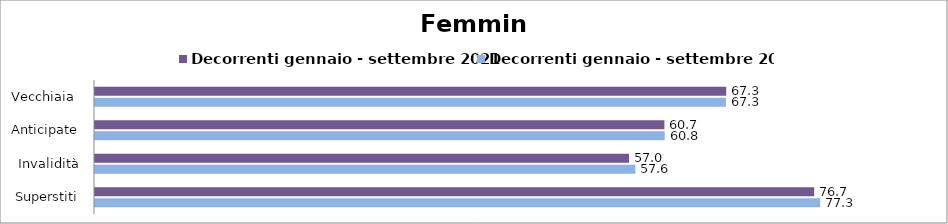
| Category | Decorrenti gennaio - settembre 2021 | Decorrenti gennaio - settembre 2022 |
|---|---|---|
| Vecchiaia  | 67.31 | 67.28 |
| Anticipate | 60.72 | 60.75 |
| Invalidità | 56.95 | 57.62 |
| Superstiti | 76.69 | 77.33 |